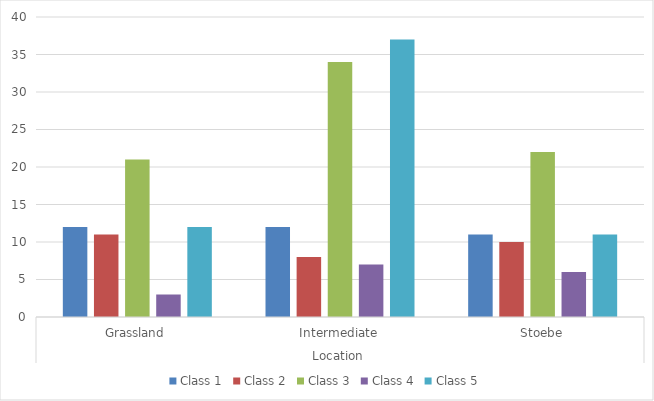
| Category | Class |
|---|---|
| 0 | 12 |
| 1 | 37 |
| 2 | 11 |